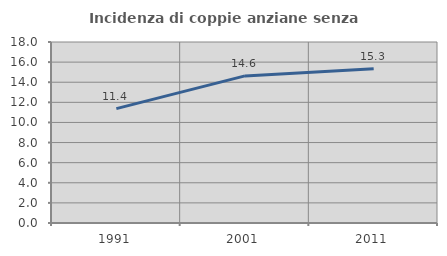
| Category | Incidenza di coppie anziane senza figli  |
|---|---|
| 1991.0 | 11.371 |
| 2001.0 | 14.63 |
| 2011.0 | 15.33 |